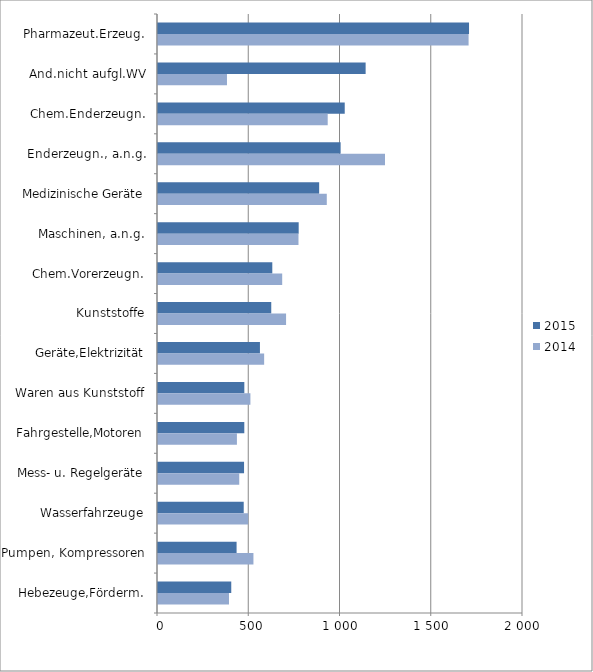
| Category | 2015 | 2014 |
|---|---|---|
| Pharmazeut.Erzeug. | 1704.295 | 1701.886 |
| And.nicht aufgl.WV | 1137.711 | 377.974 |
| Chem.Enderzeugn. | 1023.194 | 929.896 |
| Enderzeugn., a.n.g. | 1000.739 | 1243.846 |
| Medizinische Geräte | 883.087 | 924.887 |
| Maschinen, a.n.g. | 770.883 | 769.788 |
| Chem.Vorerzeugn. | 626.302 | 680.536 |
| Kunststoffe | 620.57 | 701.752 |
| Geräte,Elektrizität | 558.576 | 581.61 |
| Waren aus Kunststoff | 473.059 | 506.341 |
| Fahrgestelle,Motoren | 472.889 | 432.437 |
| Mess- u. Regelgeräte | 471.521 | 445.175 |
| Wasserfahrzeuge | 469.673 | 494.381 |
| Pumpen, Kompressoren | 430.632 | 522.943 |
| Hebezeuge,Förderm. | 401.426 | 388.979 |